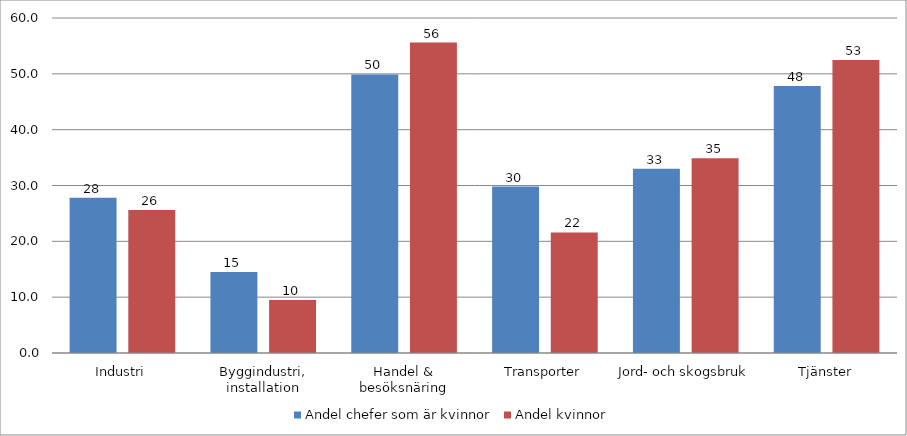
| Category | Andel chefer som är kvinnor | Andel kvinnor |
|---|---|---|
| Industri | 27.8 | 25.6 |
| Byggindustri, installation | 14.5 | 9.5 |
| Handel & besöksnäring | 49.9 | 55.6 |
| Transporter | 29.8 | 21.6 |
| Jord- och skogsbruk | 33 | 34.9 |
| Tjänster | 47.8 | 52.5 |